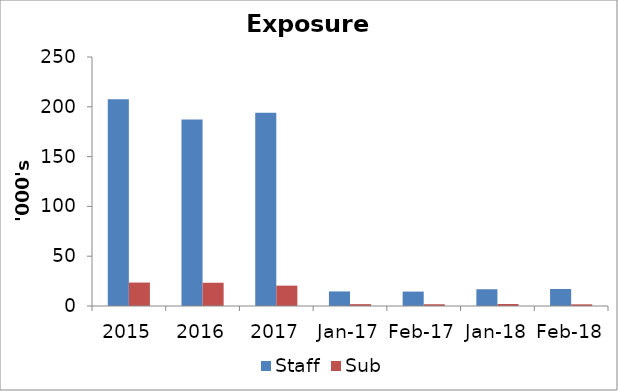
| Category | Staff | Sub |
|---|---|---|
| 2015.0 | 207536 | 23530 |
| 2016.0 | 187194 | 23350 |
| 2017.0 | 193983 | 20442 |
| 42736.0 | 14632 | 1855 |
| 42767.0 | 14473 | 1761 |
| 43101.0 | 16810 | 1985 |
| 43132.0 | 17110 | 1679 |